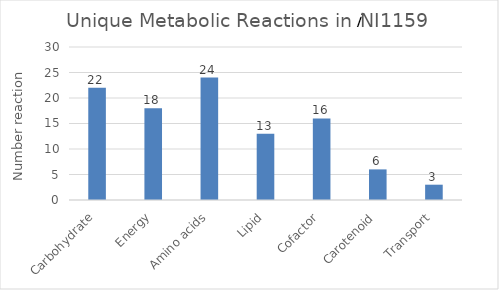
| Category | Unique Metabolic Reaction in iWV1122 in each 'metabolic network of iWV1122 |
|---|---|
| Carbohydrate | 22 |
| Energy | 18 |
| Amino acids | 24 |
| Lipid | 13 |
| Cofactor | 16 |
| Carotenoid | 6 |
| Transport | 3 |